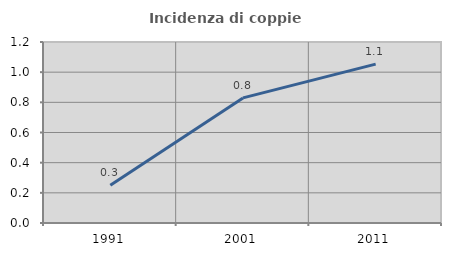
| Category | Incidenza di coppie miste |
|---|---|
| 1991.0 | 0.25 |
| 2001.0 | 0.829 |
| 2011.0 | 1.053 |